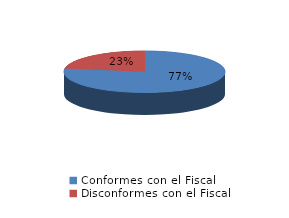
| Category | Series 0 |
|---|---|
| 0 | 1291 |
| 1 | 377 |